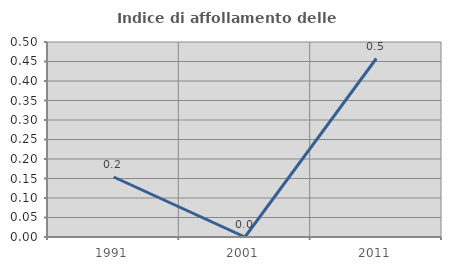
| Category | Indice di affollamento delle abitazioni  |
|---|---|
| 1991.0 | 0.154 |
| 2001.0 | 0 |
| 2011.0 | 0.458 |